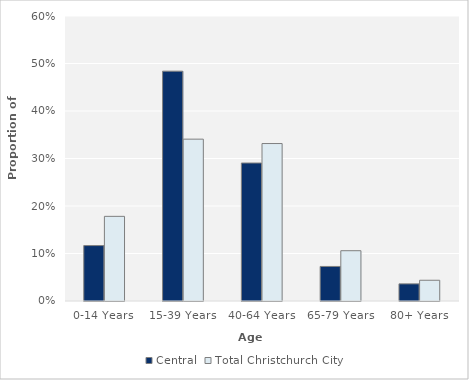
| Category | Central | Total Christchurch City |
|---|---|---|
| 0-14 Years | 0.117 | 0.178 |
| 15-39 Years | 0.484 | 0.341 |
| 40-64 Years | 0.291 | 0.331 |
| 65-79 Years | 0.073 | 0.106 |
| 80+ Years | 0.036 | 0.044 |